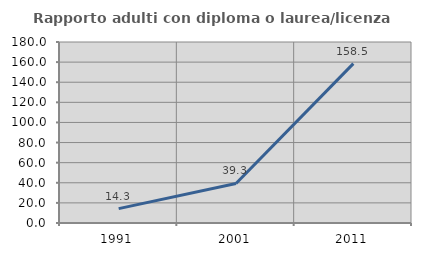
| Category | Rapporto adulti con diploma o laurea/licenza media  |
|---|---|
| 1991.0 | 14.286 |
| 2001.0 | 39.32 |
| 2011.0 | 158.519 |